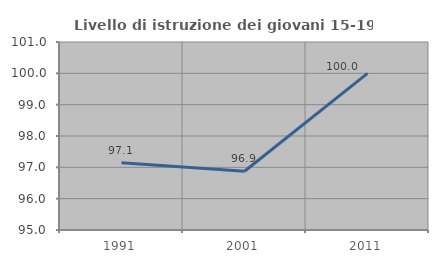
| Category | Livello di istruzione dei giovani 15-19 anni |
|---|---|
| 1991.0 | 97.143 |
| 2001.0 | 96.875 |
| 2011.0 | 100 |